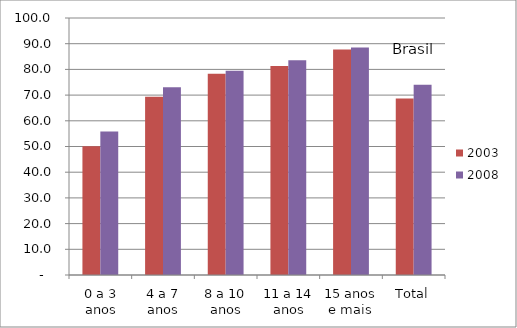
| Category | 2003 | 2008 |
|---|---|---|
| 0 a 3 anos | 50.1 | 55.8 |
| 4 a 7 anos | 69.4 | 73.1 |
| 8 a 10 anos | 78.3 | 79.5 |
| 11 a 14 anos | 81.3 | 83.6 |
| 15 anos e mais | 87.7 | 88.5 |
| Total | 68.7 | 74 |